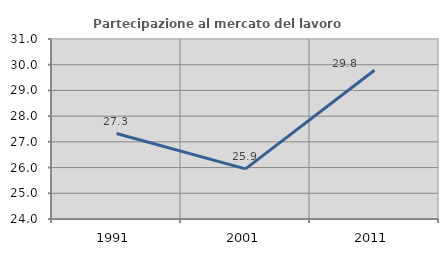
| Category | Partecipazione al mercato del lavoro  femminile |
|---|---|
| 1991.0 | 27.323 |
| 2001.0 | 25.95 |
| 2011.0 | 29.785 |